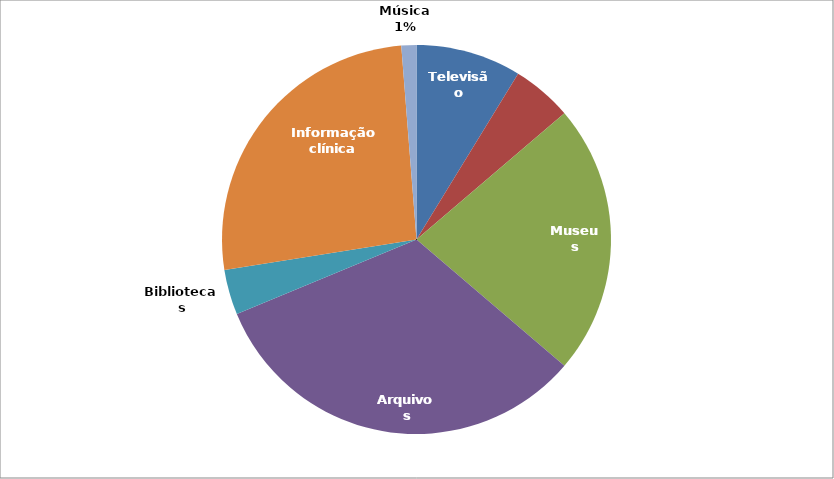
| Category | Series 0 |
|---|---|
| Televisão | 7 |
| Cinema | 4 |
| Museus | 18 |
| Arquivos | 26 |
| Bibliotecas | 3 |
| Informação clínica | 21 |
| Música | 1 |